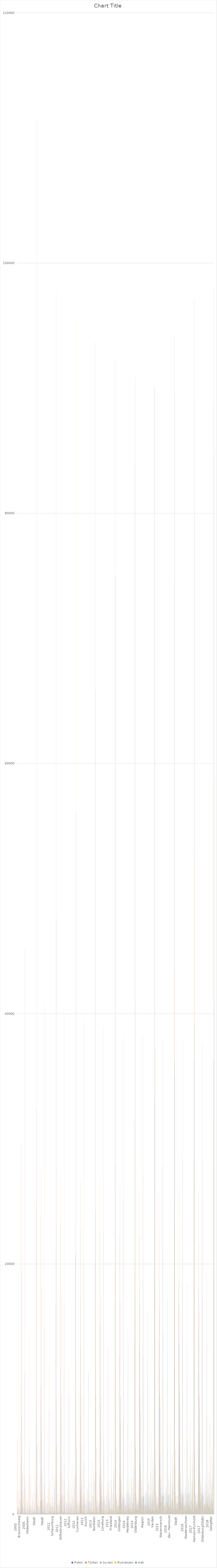
| Category | Polen | Türkei | Syrien | Rumänien | Irak |
|---|---|---|---|---|---|
| 0 | 1942 | 5957 | 183 | 238 | 212 |
| 1 | 543 | 6320 | 46 | 120 | 103 |
| 2 | 596 | 581 | 112 | 78 | 181 |
| 3 | 523 | 1903 | 61 | 54 | 100 |
| 4 | 430 | 1936 | 58 | 46 | 38 |
| 5 | 316 | 1146 | 26 | 18 | 125 |
| 6 | 336 | 1026 | 99 | 39 | 43 |
| 7 | 478 | 2946 | 101 | 32 | 70 |
| 8 | 326 | 1325 | 161 | 24 | 57 |
| 9 | 989 | 3823 | 181 | 159 | 334 |
| 10 | 6479 | 26963 | 1028 | 808 | 1263 |
| 11 | 7889 | 29699 | 978 | 732 | 2607 |
| 12 | 4696 | 19350 | 516 | 335 | 1993 |
| 13 | 3193 | 10349 | 462 | 397 | 614 |
| 14 | 754 | 1788 | 121 | 59 | 94 |
| 15 | 568 | 3221 | 142 | 55 | 46 |
| 16 | 979 | 4163 | 292 | 130 | 215 |
| 17 | 179 | 1355 | 26 | 14 | 13 |
| 18 | 482 | 1984 | 331 | 33 | 58 |
| 19 | 599 | 3060 | 153 | 59 | 145 |
| 20 | 11450 | 45270 | 2043 | 1082 | 3178 |
| 21 | 421 | 2418 | 121 | 75 | 150 |
| 22 | 426 | 1151 | 87 | 39 | 79 |
| 23 | 878 | 1619 | 96 | 126 | 58 |
| 24 | 235 | 104 | 7 | 8 | 1 |
| 25 | 585 | 995 | 117 | 37 | 157 |
| 26 | 263 | 1008 | 83 | 32 | 35 |
| 27 | 709 | 1000 | 43 | 56 | 60 |
| 28 | 464 | 1297 | 91 | 41 | 83 |
| 29 | 701 | 1961 | 70 | 85 | 116 |
| 30 | 294 | 356 | 34 | 22 | 61 |
| 31 | 446 | 2555 | 93 | 28 | 111 |
| 32 | 5422 | 14464 | 842 | 549 | 911 |
| 33 | 499 | 3167 | 104 | 26 | 70 |
| 34 | 270 | 373 | 1 | 39 | 27 |
| 35 | 715 | 2137 | 92 | 115 | 445 |
| 36 | 619 | 3213 | 72 | 59 | 41 |
| 37 | 214 | 691 | 56 | 15 | 94 |
| 38 | 271 | 722 | 97 | 25 | 92 |
| 39 | 314 | 440 | 87 | 31 | 83 |
| 40 | 782 | 1028 | 138 | 34 | 149 |
| 41 | 1625 | 1204 | 102 | 76 | 157 |
| 42 | 167 | 345 | 40 | 23 | 45 |
| 43 | 328 | 1750 | 97 | 37 | 140 |
| 44 | 399 | 639 | 111 | 122 | 98 |
| 45 | 406 | 627 | 119 | 36 | 224 |
| 46 | 1099 | 3684 | 172 | 131 | 181 |
| 47 | 906 | 3143 | 207 | 86 | 160 |
| 48 | 356 | 1574 | 43 | 80 | 77 |
| 49 | 92 | 164 | 7 | 8 | 13 |
| 50 | 9062 | 24901 | 1545 | 943 | 2096 |
| 51 | 32413 | 111598 | 5458 | 3382 | 7448 |
| 52 | 2406 | 5502 | 171 | 198 | 179 |
| 53 | 655 | 5664 | 34 | 140 | 71 |
| 54 | 761 | 620 | 156 | 86 | 189 |
| 55 | 650 | 1670 | 43 | 81 | 101 |
| 56 | 440 | 1628 | 63 | 103 | 37 |
| 57 | 449 | 967 | 50 | 30 | 58 |
| 58 | 333 | 815 | 94 | 86 | 64 |
| 59 | 652 | 2615 | 123 | 50 | 102 |
| 60 | 483 | 1025 | 154 | 50 | 54 |
| 61 | 916 | 3281 | 232 | 197 | 311 |
| 62 | 7745 | 23787 | 1120 | 1021 | 1166 |
| 63 | 10275 | 27531 | 1186 | 1331 | 3223 |
| 64 | 6422 | 17951 | 543 | 914 | 1930 |
| 65 | 3853 | 9580 | 643 | 417 | 1293 |
| 66 | 1202 | 1563 | 186 | 126 | 111 |
| 67 | 686 | 2913 | 135 | 160 | 73 |
| 68 | 1101 | 3508 | 275 | 160 | 382 |
| 69 | 182 | 1156 | 91 | 24 | 12 |
| 70 | 625 | 1567 | 345 | 137 | 125 |
| 71 | 817 | 2469 | 143 | 64 | 121 |
| 72 | 14888 | 40707 | 2361 | 2002 | 4047 |
| 73 | 566 | 1792 | 139 | 110 | 254 |
| 74 | 562 | 957 | 94 | 57 | 70 |
| 75 | 1511 | 1376 | 106 | 191 | 47 |
| 76 | 331 | 106 | 8 | 57 | 1 |
| 77 | 881 | 870 | 83 | 77 | 128 |
| 78 | 404 | 869 | 95 | 64 | 21 |
| 79 | 875 | 795 | 64 | 141 | 43 |
| 80 | 648 | 1028 | 95 | 58 | 89 |
| 81 | 1467 | 1876 | 95 | 152 | 62 |
| 82 | 395 | 254 | 48 | 51 | 27 |
| 83 | 598 | 2122 | 131 | 54 | 143 |
| 84 | 8238 | 12045 | 958 | 1012 | 885 |
| 85 | 632 | 2610 | 75 | 47 | 154 |
| 86 | 233 | 332 | 6 | 80 | 34 |
| 87 | 740 | 1772 | 153 | 162 | 884 |
| 88 | 888 | 2927 | 93 | 263 | 83 |
| 89 | 556 | 564 | 44 | 74 | 120 |
| 90 | 621 | 581 | 117 | 93 | 89 |
| 91 | 631 | 356 | 86 | 74 | 53 |
| 92 | 1451 | 910 | 171 | 1109 | 423 |
| 93 | 3498 | 1024 | 127 | 985 | 111 |
| 94 | 230 | 272 | 43 | 45 | 40 |
| 95 | 708 | 1482 | 77 | 178 | 93 |
| 96 | 562 | 417 | 117 | 204 | 90 |
| 97 | 999 | 501 | 97 | 246 | 580 |
| 98 | 2468 | 3276 | 181 | 723 | 151 |
| 99 | 1940 | 2881 | 216 | 641 | 256 |
| 100 | 457 | 1258 | 56 | 120 | 58 |
| 101 | 155 | 112 | 13 | 22 | 9 |
| 102 | 16769 | 21275 | 1672 | 5066 | 3228 |
| 103 | 47640 | 97814 | 6111 | 9101 | 9326 |
| 104 | 2770 | 5380 | 168 | 239 | 164 |
| 105 | 722 | 5541 | 81 | 169 | 73 |
| 106 | 844 | 621 | 225 | 127 | 191 |
| 107 | 761 | 1655 | 71 | 103 | 93 |
| 108 | 519 | 1616 | 75 | 119 | 34 |
| 109 | 454 | 931 | 57 | 58 | 59 |
| 110 | 357 | 787 | 107 | 87 | 78 |
| 111 | 753 | 2526 | 136 | 58 | 108 |
| 112 | 538 | 999 | 185 | 57 | 48 |
| 113 | 992 | 3192 | 353 | 246 | 294 |
| 114 | 8710 | 23248 | 1458 | 1263 | 1142 |
| 115 | 11600 | 27200 | 1391 | 1756 | 3313 |
| 116 | 7098 | 17686 | 612 | 1217 | 2004 |
| 117 | 4502 | 9514 | 779 | 539 | 1309 |
| 118 | 1521 | 1573 | 219 | 320 | 93 |
| 119 | 638 | 2847 | 203 | 188 | 68 |
| 120 | 1254 | 3419 | 355 | 222 | 385 |
| 121 | 183 | 1104 | 95 | 27 | 10 |
| 122 | 728 | 1509 | 377 | 160 | 104 |
| 123 | 916 | 2380 | 142 | 83 | 102 |
| 124 | 16840 | 40032 | 2782 | 2756 | 4075 |
| 125 | 649 | 1740 | 162 | 143 | 291 |
| 126 | 611 | 925 | 91 | 61 | 63 |
| 127 | 1561 | 1366 | 102 | 216 | 51 |
| 128 | 373 | 95 | 19 | 106 | 1 |
| 129 | 980 | 820 | 92 | 129 | 121 |
| 130 | 551 | 819 | 59 | 70 | 26 |
| 131 | 1044 | 775 | 58 | 186 | 42 |
| 132 | 818 | 982 | 129 | 86 | 84 |
| 133 | 1809 | 1828 | 59 | 196 | 61 |
| 134 | 448 | 245 | 50 | 64 | 27 |
| 135 | 727 | 2029 | 179 | 76 | 146 |
| 136 | 9571 | 11624 | 1000 | 1333 | 913 |
| 137 | 831 | 2553 | 78 | 86 | 168 |
| 138 | 404 | 338 | 12 | 102 | 44 |
| 139 | 822 | 1731 | 209 | 199 | 938 |
| 140 | 1077 | 2863 | 107 | 415 | 92 |
| 141 | 584 | 537 | 48 | 98 | 120 |
| 142 | 1031 | 557 | 137 | 136 | 93 |
| 143 | 795 | 347 | 98 | 101 | 64 |
| 144 | 2163 | 864 | 208 | 1393 | 438 |
| 145 | 4052 | 977 | 143 | 1411 | 130 |
| 146 | 263 | 261 | 40 | 47 | 34 |
| 147 | 1107 | 1420 | 85 | 198 | 82 |
| 148 | 674 | 400 | 137 | 273 | 88 |
| 149 | 1254 | 486 | 107 | 410 | 544 |
| 150 | 2976 | 3180 | 174 | 1084 | 100 |
| 151 | 2210 | 2737 | 297 | 769 | 248 |
| 152 | 506 | 1211 | 58 | 126 | 61 |
| 153 | 184 | 104 | 22 | 37 | 5 |
| 154 | 20933 | 20566 | 1960 | 6885 | 3249 |
| 155 | 56054 | 95470 | 7200 | 12237 | 9379 |
| 156 | 3115 | 5319 | 234 | 269 | 160 |
| 157 | 939 | 5465 | 203 | 243 | 76 |
| 158 | 989 | 619 | 283 | 162 | 183 |
| 159 | 815 | 1661 | 93 | 130 | 88 |
| 160 | 610 | 1592 | 156 | 125 | 39 |
| 161 | 488 | 912 | 55 | 64 | 52 |
| 162 | 414 | 750 | 135 | 150 | 77 |
| 163 | 888 | 2471 | 152 | 77 | 123 |
| 164 | 623 | 970 | 223 | 83 | 39 |
| 165 | 1075 | 3139 | 397 | 279 | 270 |
| 166 | 9956 | 22898 | 1931 | 1582 | 1107 |
| 167 | 13457 | 26767 | 1998 | 2338 | 3514 |
| 168 | 7855 | 17329 | 886 | 1567 | 2173 |
| 169 | 5602 | 9438 | 1112 | 771 | 1341 |
| 170 | 2371 | 1547 | 303 | 730 | 90 |
| 171 | 702 | 2786 | 229 | 342 | 73 |
| 172 | 1440 | 3430 | 466 | 305 | 398 |
| 173 | 185 | 1073 | 110 | 20 | 12 |
| 174 | 962 | 1457 | 463 | 240 | 110 |
| 175 | 1023 | 2330 | 164 | 111 | 93 |
| 176 | 20140 | 39390 | 3733 | 4086 | 4290 |
| 177 | 829 | 1677 | 247 | 186 | 287 |
| 178 | 769 | 870 | 87 | 85 | 67 |
| 179 | 1540 | 1360 | 118 | 206 | 38 |
| 180 | 535 | 104 | 29 | 151 | 1 |
| 181 | 1086 | 804 | 132 | 146 | 124 |
| 182 | 586 | 808 | 92 | 81 | 31 |
| 183 | 1265 | 760 | 87 | 227 | 38 |
| 184 | 1203 | 954 | 186 | 145 | 85 |
| 185 | 2189 | 1824 | 81 | 302 | 56 |
| 186 | 545 | 253 | 74 | 119 | 26 |
| 187 | 929 | 1917 | 207 | 123 | 133 |
| 188 | 11476 | 11331 | 1340 | 1771 | 886 |
| 189 | 1052 | 2492 | 113 | 91 | 166 |
| 190 | 618 | 336 | 46 | 183 | 36 |
| 191 | 989 | 1689 | 261 | 248 | 978 |
| 192 | 1184 | 2854 | 224 | 456 | 100 |
| 193 | 512 | 532 | 62 | 130 | 99 |
| 194 | 1043 | 546 | 148 | 161 | 98 |
| 195 | 1060 | 357 | 146 | 174 | 71 |
| 196 | 2430 | 837 | 231 | 1502 | 413 |
| 197 | 4378 | 938 | 172 | 1707 | 124 |
| 198 | 300 | 250 | 49 | 64 | 34 |
| 199 | 1403 | 1380 | 99 | 192 | 85 |
| 200 | 776 | 392 | 162 | 399 | 98 |
| 201 | 1529 | 461 | 135 | 535 | 530 |
| 202 | 3555 | 3146 | 272 | 1297 | 125 |
| 203 | 2592 | 2647 | 372 | 832 | 232 |
| 204 | 615 | 1152 | 52 | 154 | 64 |
| 205 | 242 | 98 | 34 | 50 | 8 |
| 206 | 24278 | 20107 | 2578 | 8175 | 3261 |
| 207 | 65850 | 93726 | 9582 | 15614 | 9544 |
| 208 | 3370 | 5272 | 414 | 298 | 150 |
| 209 | 1162 | 5400 | 521 | 411 | 83 |
| 210 | 1122 | 626 | 579 | 253 | 192 |
| 211 | 945 | 1642 | 153 | 208 | 99 |
| 212 | 664 | 1557 | 257 | 166 | 40 |
| 213 | 509 | 907 | 85 | 83 | 50 |
| 214 | 558 | 722 | 226 | 181 | 87 |
| 215 | 1022 | 2393 | 257 | 123 | 109 |
| 216 | 678 | 945 | 315 | 79 | 31 |
| 217 | 1165 | 3097 | 487 | 406 | 254 |
| 218 | 11195 | 22561 | 3294 | 2208 | 1095 |
| 219 | 15188 | 26601 | 3455 | 3186 | 3703 |
| 220 | 8789 | 17201 | 1469 | 2081 | 2293 |
| 221 | 6399 | 9400 | 1986 | 1105 | 1410 |
| 222 | 2455 | 1467 | 472 | 789 | 90 |
| 223 | 791 | 2771 | 393 | 587 | 84 |
| 224 | 1630 | 3352 | 795 | 452 | 446 |
| 225 | 172 | 1044 | 147 | 20 | 10 |
| 226 | 1122 | 1415 | 558 | 359 | 126 |
| 227 | 1142 | 2275 | 272 | 232 | 90 |
| 228 | 22500 | 38925 | 6092 | 5625 | 4549 |
| 229 | 1081 | 1625 | 429 | 379 | 309 |
| 230 | 1045 | 856 | 171 | 244 | 56 |
| 231 | 1526 | 1362 | 241 | 240 | 46 |
| 232 | 631 | 103 | 74 | 144 | 2 |
| 233 | 1180 | 776 | 311 | 206 | 132 |
| 234 | 664 | 779 | 137 | 117 | 34 |
| 235 | 1500 | 732 | 122 | 291 | 31 |
| 236 | 1426 | 937 | 287 | 185 | 72 |
| 237 | 2602 | 1809 | 145 | 439 | 64 |
| 238 | 682 | 255 | 204 | 146 | 24 |
| 239 | 1055 | 1861 | 271 | 184 | 133 |
| 240 | 13392 | 11095 | 2392 | 2575 | 903 |
| 241 | 1289 | 2461 | 232 | 260 | 164 |
| 242 | 761 | 327 | 120 | 261 | 38 |
| 243 | 1145 | 1641 | 356 | 344 | 1058 |
| 244 | 1289 | 2798 | 521 | 560 | 113 |
| 245 | 587 | 526 | 111 | 206 | 104 |
| 246 | 1163 | 516 | 280 | 265 | 131 |
| 247 | 1361 | 363 | 427 | 331 | 84 |
| 248 | 2812 | 819 | 363 | 2234 | 399 |
| 249 | 5082 | 924 | 458 | 2108 | 152 |
| 250 | 349 | 226 | 82 | 90 | 35 |
| 251 | 1715 | 1341 | 234 | 265 | 93 |
| 252 | 893 | 378 | 380 | 581 | 96 |
| 253 | 1572 | 431 | 244 | 756 | 580 |
| 254 | 3851 | 3060 | 584 | 1748 | 144 |
| 255 | 3094 | 2627 | 668 | 1204 | 269 |
| 256 | 783 | 1152 | 98 | 184 | 66 |
| 257 | 327 | 100 | 77 | 88 | 3 |
| 258 | 28073 | 19690 | 5235 | 11485 | 3529 |
| 259 | 75160 | 92271 | 17013 | 21893 | 10076 |
| 260 | 3638 | 5141 | 1268 | 423 | 338 |
| 261 | 1476 | 5340 | 1139 | 579 | 122 |
| 262 | 1202 | 633 | 920 | 316 | 293 |
| 263 | 1040 | 1633 | 311 | 281 | 103 |
| 264 | 741 | 1535 | 788 | 225 | 109 |
| 265 | 667 | 876 | 312 | 172 | 122 |
| 266 | 680 | 718 | 574 | 249 | 190 |
| 267 | 1143 | 2381 | 681 | 221 | 227 |
| 268 | 727 | 933 | 678 | 110 | 62 |
| 269 | 1291 | 3083 | 1346 | 560 | 526 |
| 270 | 12605 | 22273 | 8017 | 3136 | 2092 |
| 271 | 16964 | 26298 | 7044 | 4358 | 5616 |
| 272 | 9470 | 16986 | 2657 | 2656 | 3104 |
| 273 | 7494 | 9312 | 4387 | 1702 | 2512 |
| 274 | 2682 | 1480 | 1007 | 992 | 218 |
| 275 | 871 | 2756 | 909 | 734 | 230 |
| 276 | 1864 | 3310 | 1516 | 615 | 791 |
| 277 | 163 | 1023 | 374 | 21 | 101 |
| 278 | 1203 | 1393 | 923 | 462 | 273 |
| 279 | 1335 | 2194 | 571 | 339 | 203 |
| 280 | 25082 | 38454 | 12344 | 7521 | 7432 |
| 281 | 1228 | 1547 | 930 | 444 | 540 |
| 282 | 1248 | 855 | 912 | 262 | 165 |
| 283 | 1569 | 1356 | 437 | 257 | 142 |
| 284 | 731 | 104 | 299 | 68 | 49 |
| 285 | 1254 | 771 | 607 | 238 | 234 |
| 286 | 725 | 738 | 469 | 136 | 87 |
| 287 | 1673 | 714 | 624 | 339 | 85 |
| 288 | 1732 | 922 | 535 | 285 | 171 |
| 289 | 2766 | 1789 | 1243 | 558 | 320 |
| 290 | 754 | 259 | 314 | 178 | 43 |
| 291 | 1147 | 1813 | 832 | 245 | 297 |
| 292 | 14827 | 10868 | 7202 | 3010 | 2133 |
| 293 | 1488 | 2442 | 734 | 508 | 363 |
| 294 | 868 | 303 | 563 | 343 | 116 |
| 295 | 1319 | 1586 | 864 | 514 | 1803 |
| 296 | 1452 | 2746 | 1100 | 685 | 135 |
| 297 | 597 | 503 | 291 | 280 | 174 |
| 298 | 1261 | 509 | 635 | 362 | 161 |
| 299 | 1488 | 374 | 1174 | 496 | 194 |
| 300 | 2956 | 798 | 969 | 2575 | 587 |
| 301 | 5811 | 913 | 1510 | 2917 | 321 |
| 302 | 374 | 211 | 363 | 116 | 49 |
| 303 | 2065 | 1305 | 672 | 370 | 167 |
| 304 | 978 | 381 | 819 | 802 | 168 |
| 305 | 1679 | 415 | 725 | 945 | 795 |
| 306 | 4241 | 2998 | 1097 | 2552 | 185 |
| 307 | 3555 | 2587 | 1538 | 1567 | 420 |
| 308 | 912 | 1155 | 396 | 232 | 109 |
| 309 | 392 | 93 | 311 | 134 | 70 |
| 310 | 31436 | 19319 | 13761 | 15398 | 5817 |
| 311 | 83950 | 90914 | 41324 | 29065 | 17474 |
| 312 | 3670 | 5220 | 1640 | 480 | 495 |
| 313 | 1690 | 5285 | 2955 | 825 | 240 |
| 314 | 1255 | 630 | 1270 | 370 | 430 |
| 315 | 1020 | 1640 | 725 | 310 | 335 |
| 316 | 800 | 1495 | 1345 | 295 | 315 |
| 317 | 745 | 890 | 515 | 240 | 425 |
| 318 | 805 | 730 | 820 | 335 | 375 |
| 319 | 1245 | 2365 | 1175 | 300 | 455 |
| 320 | 720 | 920 | 1050 | 105 | 230 |
| 321 | 1375 | 3035 | 2180 | 610 | 1015 |
| 322 | 13325 | 22220 | 13675 | 3875 | 4305 |
| 323 | 18245 | 26085 | 10485 | 5600 | 8310 |
| 324 | 10095 | 16650 | 3940 | 3435 | 3850 |
| 325 | 8150 | 9435 | 6545 | 2165 | 4460 |
| 326 | 2860 | 1500 | 1470 | 995 | 750 |
| 327 | 920 | 2735 | 1460 | 995 | 710 |
| 328 | 2075 | 3255 | 2100 | 735 | 1290 |
| 329 | 150 | 1015 | 640 | 25 | 155 |
| 330 | 1395 | 1375 | 1320 | 845 | 830 |
| 331 | 1485 | 2180 | 1350 | 390 | 600 |
| 332 | 27130 | 38140 | 18825 | 9585 | 12645 |
| 333 | 1355 | 1490 | 1430 | 495 | 1400 |
| 334 | 1260 | 840 | 1620 | 490 | 505 |
| 335 | 1865 | 1390 | 1010 | 450 | 365 |
| 336 | 825 | 105 | 270 | 125 | 40 |
| 337 | 1390 | 770 | 1505 | 355 | 635 |
| 338 | 675 | 730 | 645 | 140 | 165 |
| 339 | 1700 | 720 | 1155 | 440 | 275 |
| 340 | 1910 | 915 | 1155 | 380 | 405 |
| 341 | 3135 | 1780 | 1860 | 845 | 380 |
| 342 | 845 | 265 | 630 | 220 | 160 |
| 343 | 1235 | 1760 | 1025 | 340 | 535 |
| 344 | 16205 | 10765 | 12310 | 4275 | 4875 |
| 345 | 1480 | 2410 | 1190 | 650 | 705 |
| 346 | 920 | 285 | 660 | 410 | 130 |
| 347 | 1310 | 1555 | 1415 | 560 | 2510 |
| 348 | 1535 | 2720 | 2290 | 720 | 445 |
| 349 | 615 | 500 | 1075 | 305 | 400 |
| 350 | 1355 | 505 | 1030 | 475 | 420 |
| 351 | 1520 | 385 | 1670 | 605 | 325 |
| 352 | 3350 | 780 | 1570 | 3460 | 1065 |
| 353 | 6445 | 890 | 2840 | 3600 | 945 |
| 354 | 380 | 200 | 890 | 120 | 190 |
| 355 | 2245 | 1275 | 960 | 530 | 295 |
| 356 | 1080 | 410 | 1430 | 935 | 360 |
| 357 | 1690 | 415 | 1040 | 1415 | 1225 |
| 358 | 4480 | 2995 | 2025 | 3415 | 710 |
| 359 | 3700 | 2525 | 2095 | 1880 | 830 |
| 360 | 1025 | 1140 | 650 | 285 | 275 |
| 361 | 380 | 85 | 355 | 145 | 100 |
| 362 | 33510 | 19065 | 23195 | 19515 | 10930 |
| 363 | 90175 | 90185 | 68005 | 37250 | 32755 |
| 364 | 3725 | 5105 | 1935 | 505 | 535 |
| 365 | 1805 | 5265 | 3875 | 1165 | 290 |
| 366 | 1310 | 665 | 1395 | 425 | 475 |
| 367 | 990 | 1640 | 740 | 370 | 380 |
| 368 | 850 | 1495 | 1510 | 380 | 370 |
| 369 | 820 | 880 | 450 | 340 | 405 |
| 370 | 805 | 720 | 890 | 340 | 415 |
| 371 | 1375 | 2330 | 1350 | 365 | 505 |
| 372 | 715 | 895 | 1030 | 130 | 235 |
| 373 | 1405 | 3045 | 2550 | 630 | 870 |
| 374 | 13810 | 22040 | 15725 | 4650 | 4480 |
| 375 | 18610 | 25915 | 12170 | 6145 | 9460 |
| 376 | 10120 | 16485 | 5020 | 3600 | 4390 |
| 377 | 8490 | 9430 | 7150 | 2545 | 5070 |
| 378 | 2895 | 1500 | 1575 | 1075 | 825 |
| 379 | 955 | 2725 | 1760 | 1120 | 870 |
| 380 | 2165 | 3250 | 2220 | 880 | 1480 |
| 381 | 150 | 1000 | 730 | 30 | 180 |
| 382 | 1695 | 1350 | 1375 | 1050 | 915 |
| 383 | 1555 | 2155 | 1480 | 475 | 745 |
| 384 | 28020 | 37900 | 21315 | 10775 | 14470 |
| 385 | 1465 | 1465 | 1585 | 570 | 1685 |
| 386 | 1315 | 815 | 1605 | 555 | 430 |
| 387 | 2360 | 1455 | 1085 | 670 | 360 |
| 388 | 635 | 100 | 245 | 120 | 40 |
| 389 | 1380 | 775 | 1700 | 365 | 705 |
| 390 | 670 | 740 | 670 | 195 | 245 |
| 391 | 1695 | 745 | 1105 | 530 | 280 |
| 392 | 1995 | 900 | 1030 | 435 | 395 |
| 393 | 3485 | 1790 | 2085 | 1050 | 365 |
| 394 | 895 | 280 | 675 | 285 | 185 |
| 395 | 1320 | 1730 | 1080 | 420 | 625 |
| 396 | 17215 | 10790 | 12865 | 5205 | 5315 |
| 397 | 1470 | 2380 | 1555 | 920 | 920 |
| 398 | 965 | 280 | 785 | 495 | 140 |
| 399 | 1285 | 1530 | 1680 | 650 | 2980 |
| 400 | 1580 | 2705 | 2725 | 835 | 535 |
| 401 | 635 | 485 | 1690 | 355 | 565 |
| 402 | 1510 | 480 | 1025 | 610 | 510 |
| 403 | 1610 | 405 | 1620 | 820 | 300 |
| 404 | 3195 | 765 | 1465 | 3295 | 1090 |
| 405 | 7045 | 870 | 2745 | 4640 | 1065 |
| 406 | 405 | 205 | 815 | 175 | 180 |
| 407 | 2415 | 1250 | 1035 | 585 | 285 |
| 408 | 1115 | 445 | 1380 | 1165 | 355 |
| 409 | 1825 | 400 | 950 | 1695 | 1270 |
| 410 | 4760 | 3070 | 2035 | 4270 | 700 |
| 411 | 3925 | 2480 | 2315 | 2200 | 805 |
| 412 | 1015 | 1120 | 695 | 350 | 275 |
| 413 | 405 | 75 | 345 | 180 | 90 |
| 414 | 35165 | 18945 | 24855 | 23235 | 12075 |
| 415 | 94210 | 89675 | 74755 | 43860 | 36340 |
| 416 | 3785 | 5085 | 2345 | 560 | 565 |
| 417 | 1775 | 5180 | 4090 | 1625 | 310 |
| 418 | 1360 | 700 | 1475 | 450 | 515 |
| 419 | 1020 | 1670 | 835 | 475 | 430 |
| 420 | 880 | 1470 | 1515 | 405 | 335 |
| 421 | 825 | 880 | 440 | 335 | 415 |
| 422 | 875 | 700 | 980 | 395 | 455 |
| 423 | 1425 | 2310 | 1460 | 465 | 570 |
| 424 | 745 | 905 | 1000 | 130 | 245 |
| 425 | 1480 | 3005 | 2690 | 810 | 845 |
| 426 | 14160 | 21895 | 16830 | 5650 | 4675 |
| 427 | 18495 | 25975 | 13600 | 6465 | 10505 |
| 428 | 9780 | 16430 | 5865 | 3655 | 4895 |
| 429 | 8720 | 9545 | 7735 | 2810 | 5610 |
| 430 | 3160 | 1530 | 1720 | 1350 | 905 |
| 431 | 1005 | 2690 | 1975 | 1300 | 1040 |
| 432 | 2190 | 3285 | 2475 | 1020 | 1640 |
| 433 | 145 | 965 | 675 | 50 | 185 |
| 434 | 1725 | 1345 | 1360 | 1285 | 1010 |
| 435 | 1655 | 2120 | 1520 | 545 | 825 |
| 436 | 28375 | 37905 | 23325 | 12015 | 16110 |
| 437 | 1555 | 1420 | 1640 | 780 | 1905 |
| 438 | 1435 | 810 | 1585 | 580 | 380 |
| 439 | 2635 | 1500 | 1140 | 1020 | 390 |
| 440 | 635 | 105 | 265 | 130 | 35 |
| 441 | 1460 | 775 | 1825 | 490 | 755 |
| 442 | 685 | 745 | 700 | 195 | 265 |
| 443 | 1775 | 740 | 1095 | 610 | 310 |
| 444 | 2145 | 870 | 1090 | 615 | 425 |
| 445 | 3675 | 1765 | 2340 | 1275 | 390 |
| 446 | 965 | 280 | 675 | 325 | 220 |
| 447 | 1430 | 1685 | 1100 | 480 | 695 |
| 448 | 18395 | 10690 | 13460 | 6505 | 5775 |
| 449 | 1485 | 2355 | 1685 | 1075 | 985 |
| 450 | 880 | 275 | 840 | 545 | 165 |
| 451 | 1275 | 1485 | 1870 | 790 | 3130 |
| 452 | 1585 | 2650 | 3025 | 860 | 535 |
| 453 | 645 | 480 | 1925 | 415 | 640 |
| 454 | 1570 | 500 | 1060 | 690 | 595 |
| 455 | 1655 | 410 | 1690 | 955 | 275 |
| 456 | 3435 | 755 | 1415 | 4670 | 1095 |
| 457 | 7445 | 870 | 2750 | 6065 | 1020 |
| 458 | 450 | 215 | 800 | 215 | 175 |
| 459 | 2515 | 1230 | 1130 | 625 | 330 |
| 460 | 1140 | 475 | 1495 | 1395 | 435 |
| 461 | 1805 | 390 | 930 | 1735 | 1285 |
| 462 | 5005 | 3065 | 2165 | 5185 | 695 |
| 463 | 3870 | 2430 | 2525 | 2715 | 820 |
| 464 | 1060 | 1125 | 720 | 330 | 290 |
| 465 | 400 | 75 | 295 | 195 | 115 |
| 466 | 36215 | 18785 | 26315 | 28465 | 12585 |
| 467 | 97145 | 89275 | 79930 | 52635 | 39155 |
| 468 | 3635 | 5115 | 2645 | 610 | 670 |
| 469 | 1680 | 5095 | 4325 | 1635 | 305 |
| 470 | 1330 | 700 | 1625 | 485 | 540 |
| 471 | 1050 | 1655 | 875 | 625 | 455 |
| 472 | 875 | 1450 | 1570 | 480 | 360 |
| 473 | 860 | 865 | 445 | 315 | 390 |
| 474 | 895 | 690 | 1065 | 495 | 465 |
| 475 | 1450 | 2245 | 1585 | 520 | 620 |
| 476 | 750 | 915 | 1050 | 125 | 250 |
| 477 | 1545 | 3000 | 2860 | 1135 | 815 |
| 478 | 14065 | 21725 | 18045 | 6430 | 4860 |
| 479 | 18065 | 25830 | 14770 | 6870 | 11295 |
| 480 | 9470 | 16275 | 6715 | 3715 | 5320 |
| 481 | 8595 | 9555 | 8055 | 3155 | 5975 |
| 482 | 3430 | 1540 | 1805 | 1780 | 895 |
| 483 | 1050 | 2670 | 2170 | 1295 | 1155 |
| 484 | 2320 | 3235 | 2640 | 1220 | 1740 |
| 485 | 155 | 965 | 640 | 65 | 150 |
| 486 | 1670 | 1315 | 1375 | 1180 | 1055 |
| 487 | 1730 | 2085 | 1550 | 625 | 810 |
| 488 | 28425 | 37635 | 24950 | 13035 | 17105 |
| 489 | 1595 | 1370 | 1660 | 915 | 1930 |
| 490 | 1450 | 790 | 1580 | 580 | 365 |
| 491 | 3105 | 1565 | 1190 | 1640 | 425 |
| 492 | 645 | 110 | 275 | 135 | 55 |
| 493 | 1465 | 775 | 1910 | 555 | 795 |
| 494 | 725 | 750 | 715 | 190 | 285 |
| 495 | 1840 | 725 | 1150 | 725 | 320 |
| 496 | 2350 | 910 | 1170 | 745 | 500 |
| 497 | 3735 | 1775 | 2490 | 1520 | 400 |
| 498 | 940 | 280 | 710 | 345 | 225 |
| 499 | 1385 | 1660 | 1145 | 585 | 720 |
| 500 | 19240 | 10710 | 13990 | 7930 | 6025 |
| 501 | 1425 | 2305 | 1775 | 1120 | 995 |
| 502 | 835 | 270 | 945 | 570 | 160 |
| 503 | 1365 | 1440 | 2040 | 965 | 3370 |
| 504 | 1585 | 2640 | 3300 | 975 | 575 |
| 505 | 680 | 475 | 2100 | 525 | 650 |
| 506 | 1655 | 500 | 1090 | 785 | 595 |
| 507 | 1495 | 425 | 1705 | 1075 | 285 |
| 508 | 3420 | 745 | 1370 | 4515 | 1110 |
| 509 | 7360 | 900 | 2890 | 6875 | 990 |
| 510 | 475 | 225 | 805 | 185 | 170 |
| 511 | 2630 | 1215 | 1200 | 725 | 355 |
| 512 | 1240 | 495 | 1655 | 1635 | 455 |
| 513 | 1820 | 390 | 945 | 2405 | 1280 |
| 514 | 4895 | 3065 | 2255 | 5560 | 735 |
| 515 | 3900 | 2380 | 2685 | 3020 | 895 |
| 516 | 1110 | 1110 | 735 | 415 | 305 |
| 517 | 395 | 75 | 325 | 225 | 115 |
| 518 | 36290 | 18660 | 27820 | 31580 | 13040 |
| 519 | 98015 | 88735 | 84805 | 58980 | 41035 |